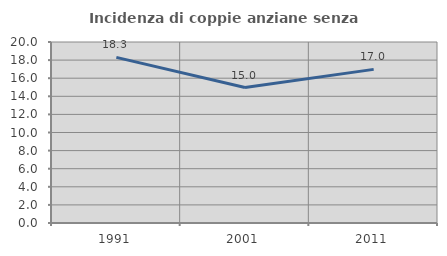
| Category | Incidenza di coppie anziane senza figli  |
|---|---|
| 1991.0 | 18.305 |
| 2001.0 | 14.964 |
| 2011.0 | 16.974 |